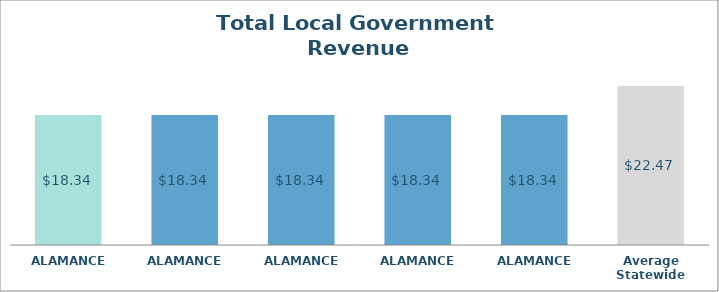
| Category | Series 0 |
|---|---|
| ALAMANCE  | 18.345 |
| ALAMANCE  | 18.345 |
| ALAMANCE  | 18.345 |
| ALAMANCE  | 18.345 |
| ALAMANCE  | 18.345 |
| Average Statewide | 22.473 |